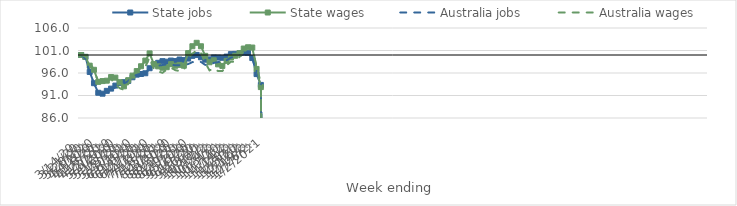
| Category | State jobs | State wages | Australia jobs | Australia wages |
|---|---|---|---|---|
| 14/03/2020 | 100 | 100 | 100 | 100 |
| 21/03/2020 | 99.574 | 99.578 | 99.218 | 99.669 |
| 28/03/2020 | 96.234 | 97.63 | 96.159 | 98.38 |
| 04/04/2020 | 93.731 | 96.712 | 93.511 | 96.663 |
| 11/04/2020 | 91.608 | 94.026 | 91.845 | 94.08 |
| 18/04/2020 | 91.404 | 94.208 | 91.454 | 93.993 |
| 25/04/2020 | 92.032 | 94.295 | 91.82 | 94.131 |
| 02/05/2020 | 92.528 | 95.094 | 92.24 | 94.625 |
| 09/05/2020 | 93.204 | 94.966 | 92.814 | 93.438 |
| 16/05/2020 | 93.797 | 93.961 | 93.355 | 92.628 |
| 23/05/2020 | 93.965 | 93.04 | 93.675 | 92.257 |
| 30/05/2020 | 94.231 | 94.403 | 94.182 | 93.555 |
| 06/06/2020 | 95.052 | 95.414 | 95.129 | 95.487 |
| 13/06/2020 | 95.632 | 96.43 | 95.64 | 96.179 |
| 20/06/2020 | 95.78 | 97.5 | 95.803 | 97.167 |
| 27/06/2020 | 95.942 | 98.763 | 95.768 | 97.377 |
| 04/07/2020 | 97.059 | 100.358 | 97.026 | 99.465 |
| 11/07/2020 | 97.9 | 97.98 | 97.722 | 96.839 |
| 18/07/2020 | 98.266 | 97.479 | 97.64 | 96.355 |
| 25/07/2020 | 98.634 | 97.166 | 97.768 | 96.035 |
| 01/08/2020 | 98.519 | 97.289 | 97.912 | 96.762 |
| 08/08/2020 | 98.766 | 97.964 | 97.848 | 97.159 |
| 15/08/2020 | 98.656 | 97.606 | 97.715 | 96.636 |
| 22/08/2020 | 98.995 | 97.805 | 97.726 | 96.439 |
| 29/08/2020 | 98.869 | 97.621 | 97.792 | 96.622 |
| 05/09/2020 | 99.203 | 100.417 | 97.988 | 99.323 |
| 12/09/2020 | 99.809 | 101.948 | 98.415 | 100.272 |
| 19/09/2020 | 100.015 | 102.709 | 98.579 | 101.043 |
| 26/09/2020 | 99.49 | 101.941 | 98.452 | 100.421 |
| 03/10/2020 | 98.957 | 99.816 | 97.813 | 98.297 |
| 10/10/2020 | 99.022 | 98.382 | 97.688 | 96.578 |
| 17/10/2020 | 99.45 | 98.828 | 98.252 | 97.02 |
| 24/10/2020 | 99.426 | 97.919 | 98.419 | 96.422 |
| 31/10/2020 | 99.38 | 97.573 | 98.499 | 96.422 |
| 07/11/2020 | 99.645 | 98.693 | 98.826 | 97.695 |
| 14/11/2020 | 100.195 | 99.443 | 99.425 | 98.506 |
| 21/11/2020 | 100.237 | 99.828 | 99.648 | 98.519 |
| 28/11/2020 | 100.358 | 100.386 | 99.873 | 99.566 |
| 05/12/2020 | 100.511 | 101.434 | 100.204 | 100.773 |
| 12/12/2020 | 100.479 | 101.719 | 100.228 | 101.122 |
| 19/12/2020 | 99.322 | 101.658 | 99.39 | 101.653 |
| 26/12/2020 | 95.76 | 96.906 | 96.352 | 97.474 |
| 02/01/2021 | 93.353 | 92.865 | 93.927 | 93.755 |